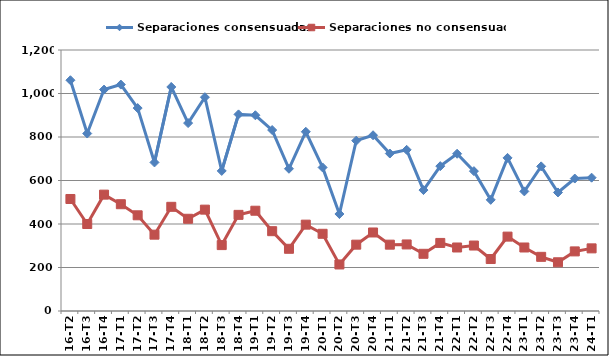
| Category | Separaciones consensuadas | Separaciones no consensuadas |
|---|---|---|
| 16-T2 | 1061 | 515 |
| 16-T3 | 816 | 400 |
| 16-T4 | 1018 | 535 |
| 17-T1 | 1041 | 491 |
| 17-T2 | 933 | 440 |
| 17-T3 | 683 | 351 |
| 17-T4 | 1030 | 479 |
| 18-T1 | 864 | 424 |
| 18-T2 | 983 | 466 |
| 18-T3 | 644 | 303 |
| 18-T4 | 904 | 442 |
| 19-T1 | 900 | 461 |
| 19-T2 | 832 | 367 |
| 19-T3 | 654 | 286 |
| 19-T4 | 824 | 397 |
| 20-T1 | 660 | 355 |
| 20-T2 | 446 | 214 |
| 20-T3 | 783 | 305 |
| 20-T4 | 808 | 361 |
| 21-T1 | 724 | 305 |
| 21-T2 | 741 | 306 |
| 21-T3 | 556 | 263 |
| 21-T4 | 666 | 313 |
| 22-T1 | 723 | 292 |
| 22-T2 | 643 | 301 |
| 22-T3 | 511 | 239 |
| 22-T4 | 704 | 342 |
| 23-T1 | 550 | 292 |
| 23-T2 | 665 | 249 |
| 23-T3 | 545 | 224 |
| 23-T4 | 609 | 274 |
| 24-T1 | 613 | 288 |